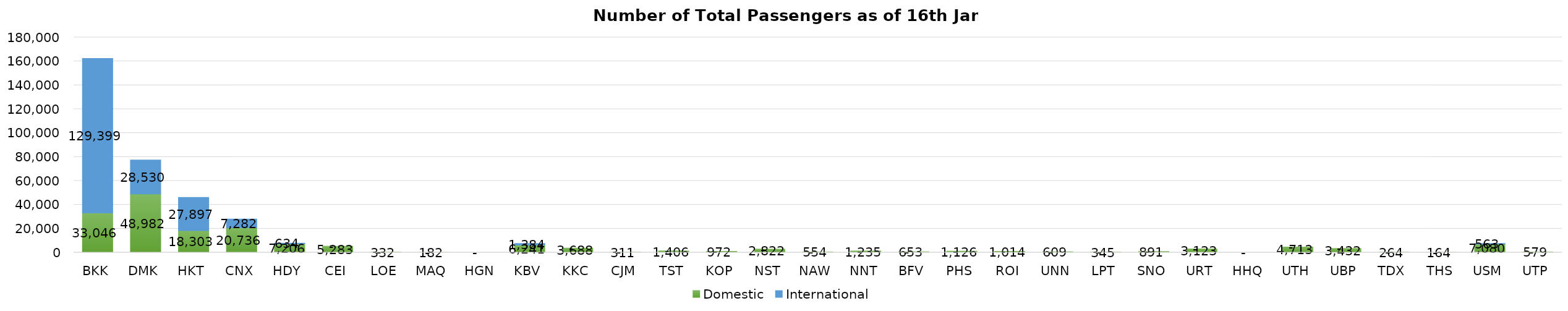
| Category | Domestic | International |
|---|---|---|
| BKK | 33046 | 129399 |
| DMK | 48982 | 28530 |
| HKT | 18303 | 27897 |
| CNX | 20736 | 7282 |
| HDY | 7206 | 634 |
| CEI | 5283 | 0 |
| LOE | 332 | 0 |
| MAQ | 182 | 0 |
| HGN | 0 | 0 |
| KBV | 6241 | 1384 |
| KKC | 3688 | 0 |
| CJM | 311 | 0 |
| TST | 1406 | 0 |
| KOP | 972 | 0 |
| NST | 2822 | 0 |
| NAW | 554 | 0 |
| NNT | 1235 | 0 |
| BFV | 653 | 0 |
| PHS | 1126 | 0 |
| ROI | 1014 | 0 |
| UNN | 609 | 0 |
| LPT | 345 | 0 |
| SNO | 891 | 0 |
| URT | 3123 | 0 |
| HHQ | 0 | 0 |
| UTH | 4713 | 0 |
| UBP | 3432 | 0 |
| TDX | 264 | 0 |
| THS | 164 | 0 |
| USM | 7080 | 563 |
| UTP | 579 | 0 |